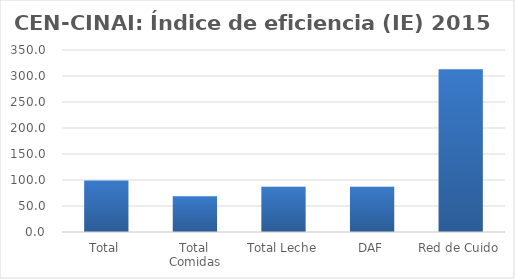
| Category | Índice de eficiencia (IE)  |
|---|---|
| Total | 99.198 |
| Total Comidas | 68.69 |
| Total Leche | 86.871 |
| DAF | 87.161 |
| Red de Cuido | 312.862 |